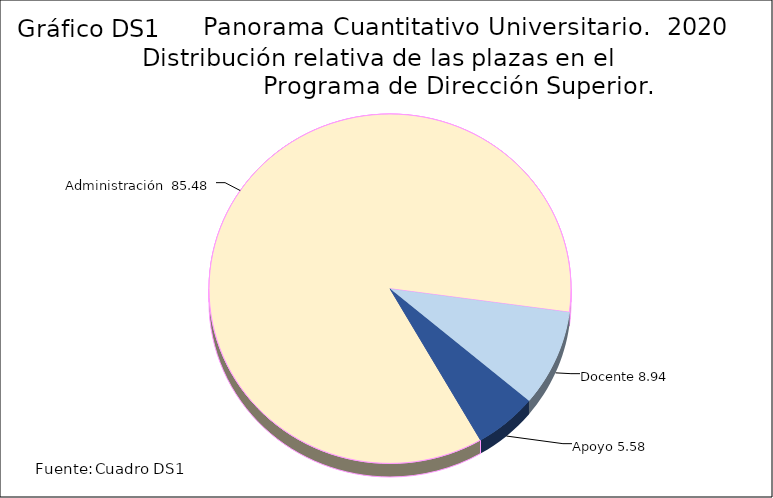
| Category | Series 3 |
|---|---|
| Administración  | 85.48 |
| Docente | 8.94 |
| Apoyo | 5.58 |